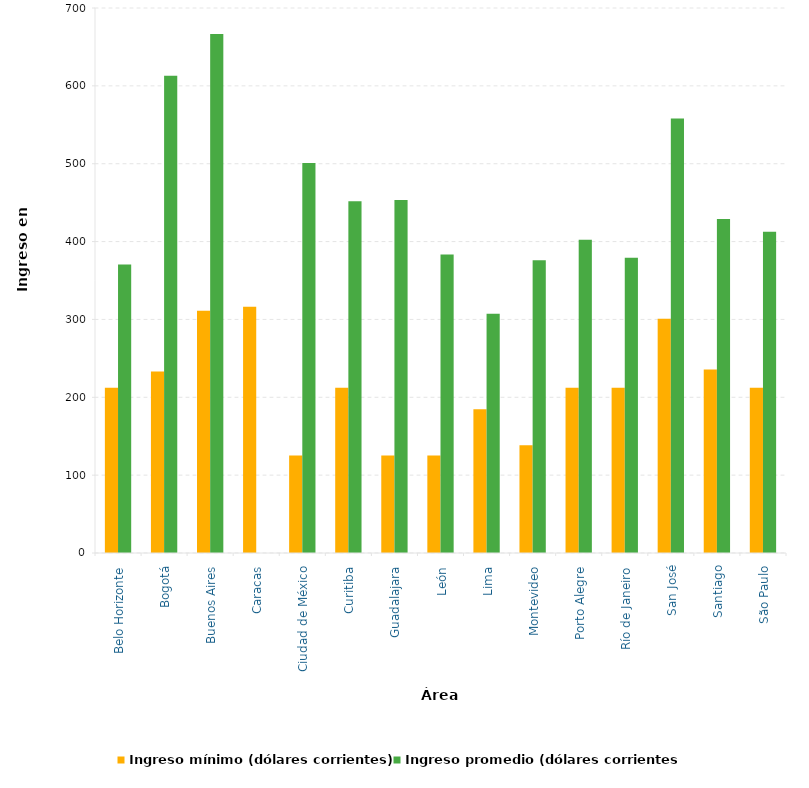
| Category | Ingreso mínimo (dólares corrientes) | Ingreso promedio (dólares corrientes) |
|---|---|---|
| Belo Horizonte | 212.291 | 370.435 |
| Bogotá | 233.118 | 612.842 |
| Buenos Aires | 311.1 | 666.455 |
| Caracas | 316.279 | 0 |
| Ciudad de México | 125.214 | 500.857 |
| Curitiba | 212.291 | 451.938 |
| Guadalajara | 125.214 | 453.276 |
| León | 125.214 | 383.41 |
| Lima | 184.564 | 307.248 |
| Montevideo | 138.508 | 376.073 |
| Porto Alegre | 212.291 | 402.476 |
| Río de Janeiro | 212.291 | 379.341 |
| San José | 300.852 | 558.202 |
| Santiago | 235.733 | 428.838 |
| São Paulo | 212.291 | 412.671 |